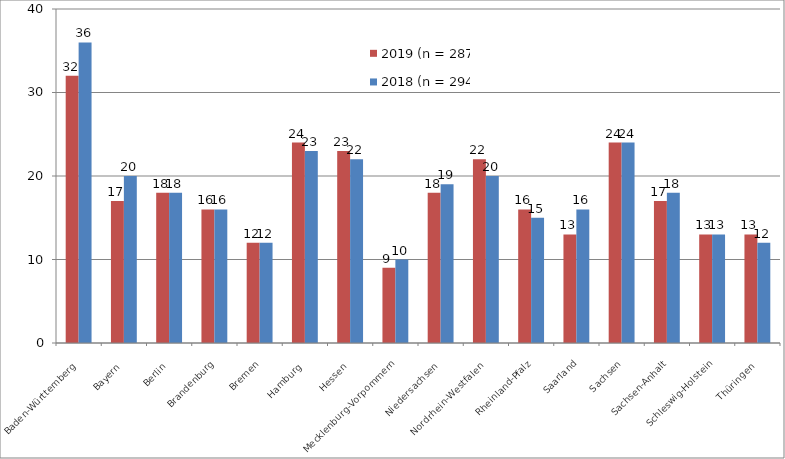
| Category | 2019 (n = 287) | 2018 (n = 294) |
|---|---|---|
| Baden-Württemberg | 32 | 36 |
| Bayern | 17 | 20 |
| Berlin | 18 | 18 |
| Brandenburg | 16 | 16 |
| Bremen | 12 | 12 |
| Hamburg | 24 | 23 |
| Hessen | 23 | 22 |
| Mecklenburg-Vorpommern | 9 | 10 |
| Niedersachsen | 18 | 19 |
| Nordrhein-Westfalen | 22 | 20 |
| Rheinland-Pfalz | 16 | 15 |
| Saarland | 13 | 16 |
| Sachsen | 24 | 24 |
| Sachsen-Anhalt | 17 | 18 |
| Schleswig-Holstein | 13 | 13 |
| Thüringen | 13 | 12 |